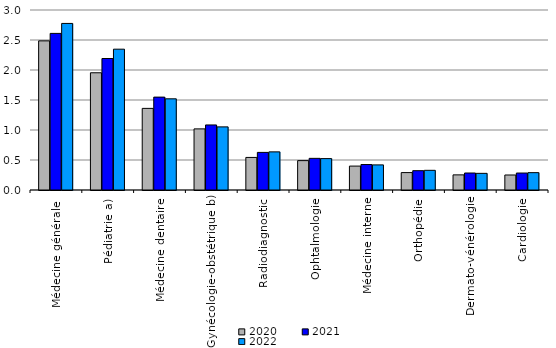
| Category | 2020 | 2021 | 2022 |
|---|---|---|---|
| Médecine générale  | 2.486 | 2.61 | 2.776 |
| Pédiatrie a) | 1.954 | 2.191 | 2.347 |
| Médecine dentaire | 1.36 | 1.548 | 1.52 |
| Gynécologie-obstétrique b) | 1.019 | 1.084 | 1.052 |
| Radiodiagnostic | 0.543 | 0.627 | 0.636 |
| Ophtalmologie | 0.49 | 0.527 | 0.523 |
| Médecine interne | 0.398 | 0.424 | 0.418 |
| Orthopédie | 0.29 | 0.322 | 0.328 |
| Dermato-vénérologie | 0.252 | 0.283 | 0.277 |
| Cardiologie | 0.25 | 0.283 | 0.289 |